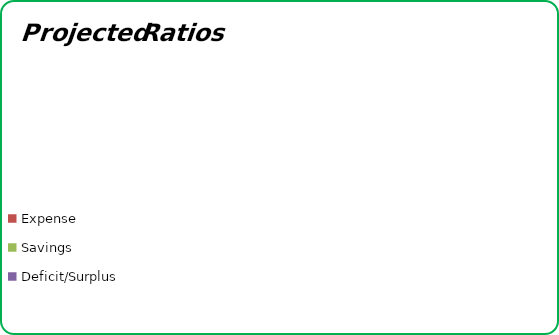
| Category | Series 0 |
|---|---|
| Debt to Income | 0 |
| Expense | 0 |
| Savings | 0 |
| Deficit/Surplus | 0 |